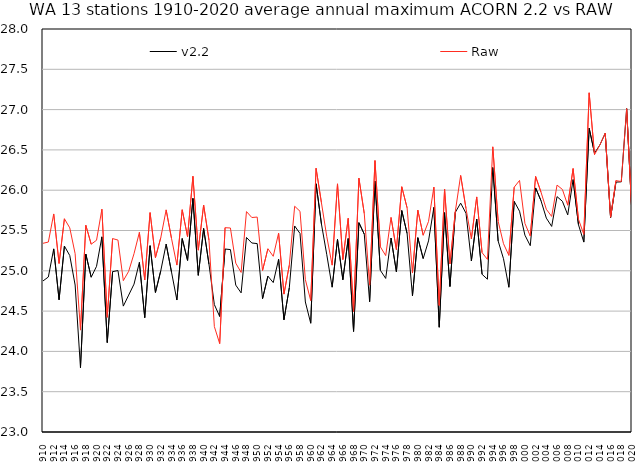
| Category | v2.2 | Raw |
|---|---|---|
| 1910 | 24.874 | 25.341 |
| 1911 | 24.923 | 25.357 |
| 1912 | 25.272 | 25.705 |
| 1913 | 24.641 | 25.091 |
| 1914 | 25.307 | 25.646 |
| 1915 | 25.189 | 25.533 |
| 1916 | 24.824 | 25.212 |
| 1917 | 23.798 | 24.264 |
| 1918 | 25.207 | 25.565 |
| 1919 | 24.92 | 25.33 |
| 1920 | 25.056 | 25.379 |
| 1921 | 25.422 | 25.764 |
| 1922 | 24.109 | 24.423 |
| 1923 | 24.989 | 25.4 |
| 1924 | 25.003 | 25.381 |
| 1925 | 24.562 | 24.878 |
| 1926 | 24.699 | 24.994 |
| 1927 | 24.835 | 25.213 |
| 1928 | 25.104 | 25.477 |
| 1929 | 24.419 | 24.886 |
| 1930 | 25.311 | 25.722 |
| 1931 | 24.731 | 25.163 |
| 1932 | 25.002 | 25.413 |
| 1933 | 25.332 | 25.756 |
| 1934 | 24.984 | 25.402 |
| 1935 | 24.637 | 25.071 |
| 1936 | 25.4 | 25.757 |
| 1937 | 25.129 | 25.423 |
| 1938 | 25.898 | 26.173 |
| 1939 | 24.944 | 25.256 |
| 1940 | 25.525 | 25.816 |
| 1941 | 25.08 | 25.379 |
| 1942 | 24.581 | 24.308 |
| 1943 | 24.433 | 24.096 |
| 1944 | 25.27 | 25.535 |
| 1945 | 25.263 | 25.531 |
| 1946 | 24.822 | 25.095 |
| 1947 | 24.726 | 24.98 |
| 1948 | 25.414 | 25.735 |
| 1949 | 25.345 | 25.661 |
| 1950 | 25.338 | 25.667 |
| 1951 | 24.654 | 25.004 |
| 1952 | 24.934 | 25.273 |
| 1953 | 24.854 | 25.18 |
| 1954 | 25.142 | 25.467 |
| 1955 | 24.392 | 24.711 |
| 1956 | 24.789 | 25.07 |
| 1957 | 25.556 | 25.801 |
| 1958 | 25.463 | 25.738 |
| 1959 | 24.613 | 24.89 |
| 1960 | 24.349 | 24.631 |
| 1961 | 26.079 | 26.272 |
| 1962 | 25.581 | 25.845 |
| 1963 | 25.199 | 25.423 |
| 1964 | 24.797 | 25.07 |
| 1965 | 25.389 | 26.079 |
| 1966 | 24.889 | 25.139 |
| 1967 | 25.401 | 25.651 |
| 1968 | 24.247 | 24.495 |
| 1969 | 25.597 | 26.149 |
| 1970 | 25.454 | 25.71 |
| 1971 | 24.616 | 24.822 |
| 1972 | 26.113 | 26.368 |
| 1973 | 25.006 | 25.298 |
| 1974 | 24.905 | 25.189 |
| 1975 | 25.407 | 25.662 |
| 1976 | 24.988 | 25.263 |
| 1977 | 25.748 | 26.043 |
| 1978 | 25.463 | 25.781 |
| 1979 | 24.689 | 24.972 |
| 1980 | 25.411 | 25.753 |
| 1981 | 25.152 | 25.441 |
| 1982 | 25.371 | 25.612 |
| 1983 | 25.787 | 26.038 |
| 1984 | 24.3 | 24.571 |
| 1985 | 25.721 | 26.014 |
| 1986 | 24.805 | 25.085 |
| 1987 | 25.725 | 25.735 |
| 1988 | 25.84 | 26.183 |
| 1989 | 25.714 | 25.772 |
| 1990 | 25.122 | 25.395 |
| 1991 | 25.642 | 25.916 |
| 1992 | 24.957 | 25.226 |
| 1993 | 24.896 | 25.141 |
| 1994 | 26.282 | 26.538 |
| 1995 | 25.37 | 25.616 |
| 1996 | 25.15 | 25.337 |
| 1997 | 24.796 | 25.192 |
| 1998 | 25.861 | 26.037 |
| 1999 | 25.739 | 26.121 |
| 2000 | 25.442 | 25.588 |
| 2001 | 25.312 | 25.431 |
| 2002 | 26.028 | 26.171 |
| 2003 | 25.87 | 25.976 |
| 2004 | 25.654 | 25.764 |
| 2005 | 25.551 | 25.674 |
| 2006 | 25.92 | 26.063 |
| 2007 | 25.863 | 26.009 |
| 2008 | 25.694 | 25.814 |
| 2009 | 26.132 | 26.269 |
| 2010 | 25.573 | 25.64 |
| 2011 | 25.356 | 25.452 |
| 2012 | 26.77 | 27.208 |
| 2013 | 26.46 | 26.441 |
| 2014 | 26.561 | 26.561 |
| 2015 | 26.706 | 26.708 |
| 2016 | 25.66 | 25.665 |
| 2017 | 26.1 | 26.12 |
| 2018 | 26.104 | 26.107 |
| 2019 | 27.012 | 27.011 |
| 2020 | 25.686 | 25.693 |